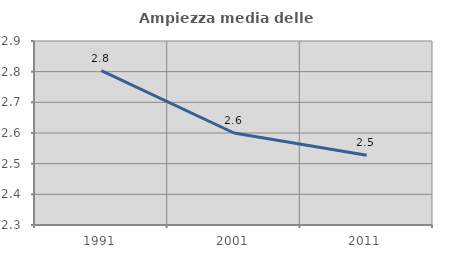
| Category | Ampiezza media delle famiglie |
|---|---|
| 1991.0 | 2.804 |
| 2001.0 | 2.6 |
| 2011.0 | 2.527 |